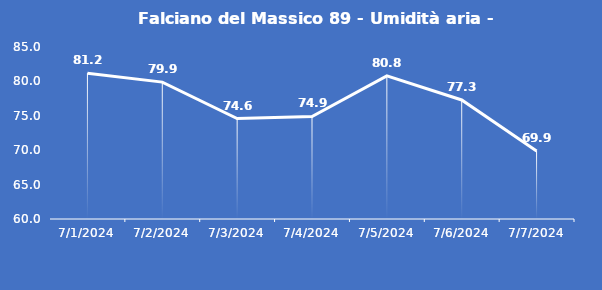
| Category | Falciano del Massico 89 - Umidità aria - Grezzo (%) |
|---|---|
| 7/1/24 | 81.2 |
| 7/2/24 | 79.9 |
| 7/3/24 | 74.6 |
| 7/4/24 | 74.9 |
| 7/5/24 | 80.8 |
| 7/6/24 | 77.3 |
| 7/7/24 | 69.9 |